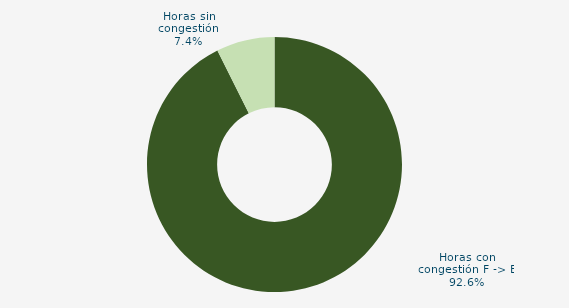
| Category | Horas con congestión E -> F |
|---|---|
| Horas con congestión E -> F | 0 |
| Horas con congestión F -> E | 92.608 |
| Horas sin congestión | 7.392 |